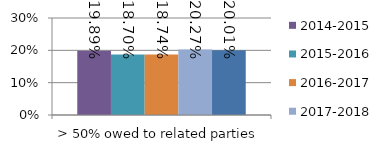
| Category | 2014-2015 | 2015-2016 | 2016-2017 | 2017-2018 | 2018-2019 |
|---|---|---|---|---|---|
| > 50% owed to related parties | 0.199 | 0.187 | 0.187 | 0.203 | 0.2 |